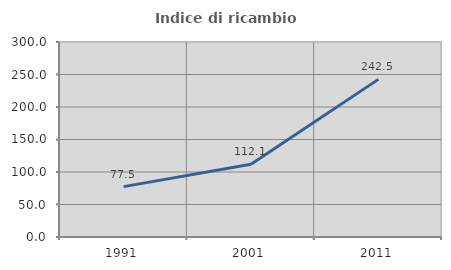
| Category | Indice di ricambio occupazionale  |
|---|---|
| 1991.0 | 77.5 |
| 2001.0 | 112.069 |
| 2011.0 | 242.5 |